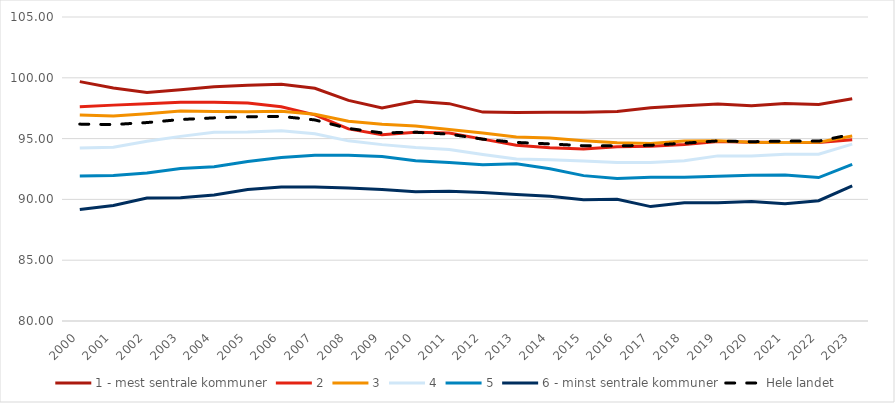
| Category | 1 - mest sentrale kommuner | 2 | 3 | 4 | 5 | 6 - minst sentrale kommuner | Hele landet |
|---|---|---|---|---|---|---|---|
| 2000.0 | 99.684 | 97.628 | 96.937 | 94.235 | 91.933 | 89.163 | 96.191 |
| 2001.0 | 99.167 | 97.753 | 96.866 | 94.293 | 91.967 | 89.496 | 96.156 |
| 2002.0 | 98.783 | 97.867 | 97.05 | 94.78 | 92.168 | 90.119 | 96.319 |
| 2003.0 | 99.014 | 97.986 | 97.265 | 95.184 | 92.538 | 90.142 | 96.569 |
| 2004.0 | 99.273 | 97.99 | 97.238 | 95.518 | 92.688 | 90.369 | 96.706 |
| 2005.0 | 99.383 | 97.924 | 97.214 | 95.547 | 93.125 | 90.814 | 96.797 |
| 2006.0 | 99.47 | 97.622 | 97.246 | 95.645 | 93.446 | 91.015 | 96.827 |
| 2007.0 | 99.142 | 96.951 | 96.997 | 95.397 | 93.625 | 91.025 | 96.535 |
| 2008.0 | 98.144 | 95.801 | 96.434 | 94.814 | 93.637 | 90.946 | 95.834 |
| 2009.0 | 97.517 | 95.311 | 96.178 | 94.505 | 93.524 | 90.811 | 95.47 |
| 2010.0 | 98.062 | 95.517 | 96.035 | 94.269 | 93.18 | 90.639 | 95.523 |
| 2011.0 | 97.876 | 95.454 | 95.741 | 94.101 | 93.028 | 90.675 | 95.366 |
| 2012.0 | 97.179 | 94.956 | 95.46 | 93.692 | 92.843 | 90.561 | 94.953 |
| 2013.0 | 97.148 | 94.456 | 95.141 | 93.318 | 92.923 | 90.394 | 94.685 |
| 2014.0 | 97.159 | 94.25 | 95.04 | 93.253 | 92.524 | 90.261 | 94.563 |
| 2015.0 | 97.163 | 94.143 | 94.829 | 93.16 | 91.954 | 89.962 | 94.413 |
| 2016.0 | 97.227 | 94.327 | 94.655 | 93.029 | 91.715 | 90.009 | 94.401 |
| 2017.0 | 97.532 | 94.378 | 94.588 | 93.032 | 91.813 | 89.408 | 94.451 |
| 2018.0 | 97.709 | 94.518 | 94.794 | 93.173 | 91.812 | 89.734 | 94.623 |
| 2019.0 | 97.843 | 94.754 | 94.828 | 93.578 | 91.912 | 89.724 | 94.808 |
| 2020.0 | 97.693 | 94.7 | 94.697 | 93.579 | 91.983 | 89.828 | 94.743 |
| 2021.0 | 97.879 | 94.67 | 94.687 | 93.72 | 92.003 | 89.634 | 94.798 |
| 2022.0 | 97.814 | 94.683 | 94.692 | 93.719 | 91.796 | 89.895 | 94.793 |
| 2023.0 | 98.283 | 94.91 | 95.213 | 94.541 | 92.889 | 91.119 | 95.353 |